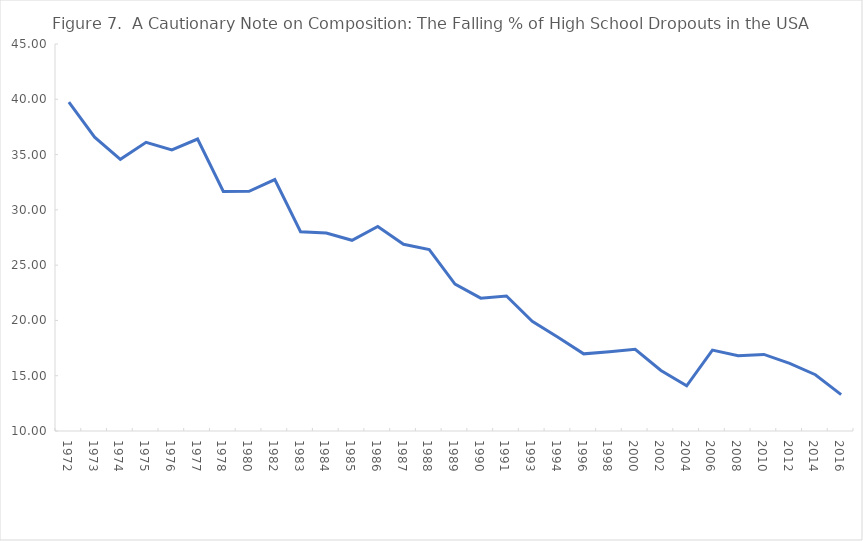
| Category | Dropout |
|---|---|
| 1972.0 | 39.74 |
| 1973.0 | 36.569 |
| 1974.0 | 34.569 |
| 1975.0 | 36.107 |
| 1976.0 | 35.424 |
| 1977.0 | 36.405 |
| 1978.0 | 31.658 |
| 1980.0 | 31.676 |
| 1982.0 | 32.742 |
| 1983.0 | 28.018 |
| 1984.0 | 27.902 |
| 1985.0 | 27.249 |
| 1986.0 | 28.503 |
| 1987.0 | 26.883 |
| 1988.0 | 26.401 |
| 1989.0 | 23.292 |
| 1990.0 | 22.012 |
| 1991.0 | 22.215 |
| 1993.0 | 19.925 |
| 1994.0 | 18.483 |
| 1996.0 | 16.977 |
| 1998.0 | 17.161 |
| 2000.0 | 17.394 |
| 2002.0 | 15.479 |
| 2004.0 | 14.083 |
| 2006.0 | 17.317 |
| 2008.0 | 16.807 |
| 2010.0 | 16.928 |
| 2012.0 | 16.109 |
| 2014.0 | 15.091 |
| 2016.0 | 13.289 |